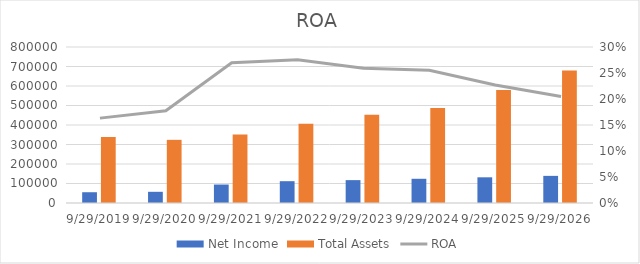
| Category | Net Income | Total Assets |
|---|---|---|
| 9/29/2019 | 55256 | 338516 |
| 9/29/2020 | 57411 | 323888 |
| 9/29/2021 | 94680 | 351002 |
| 9/29/2022 | 111866.274 | 405933.813 |
| 9/29/2023 | 117305.039 | 452419.73 |
| 9/29/2024 | 124211.372 | 486857.919 |
| 9/29/2025 | 131734.795 | 580123.538 |
| 9/29/2026 | 139122.006 | 679476.209 |